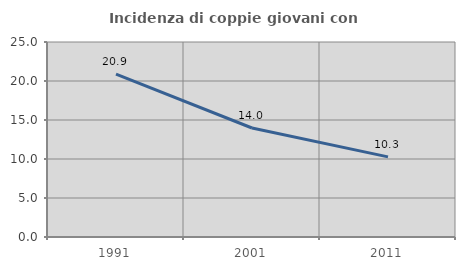
| Category | Incidenza di coppie giovani con figli |
|---|---|
| 1991.0 | 20.894 |
| 2001.0 | 13.975 |
| 2011.0 | 10.269 |